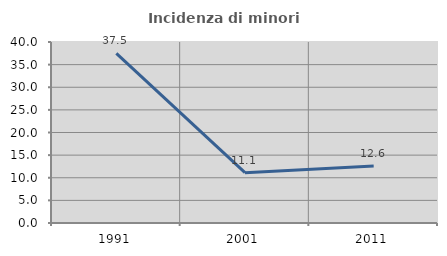
| Category | Incidenza di minori stranieri |
|---|---|
| 1991.0 | 37.5 |
| 2001.0 | 11.111 |
| 2011.0 | 12.617 |